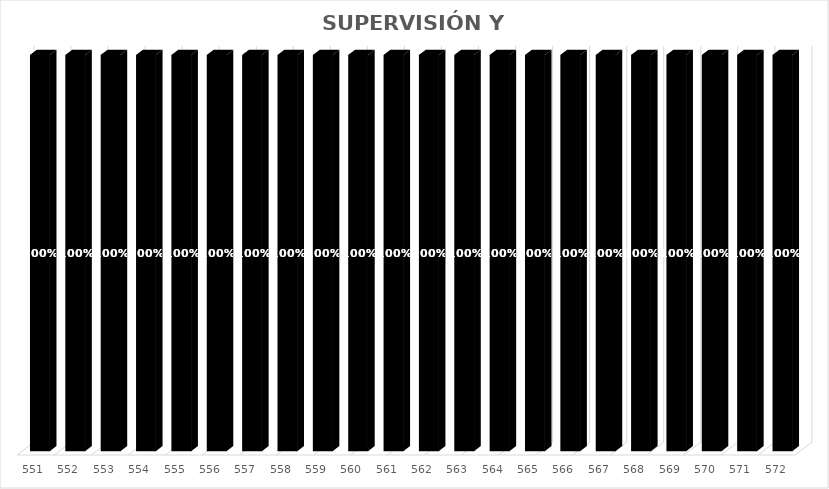
| Category | % Avance |
|---|---|
| 551.0 | 1 |
| 552.0 | 1 |
| 553.0 | 1 |
| 554.0 | 1 |
| 555.0 | 1 |
| 556.0 | 1 |
| 557.0 | 1 |
| 558.0 | 1 |
| 559.0 | 1 |
| 560.0 | 1 |
| 561.0 | 1 |
| 562.0 | 1 |
| 563.0 | 1 |
| 564.0 | 1 |
| 565.0 | 1 |
| 566.0 | 1 |
| 567.0 | 1 |
| 568.0 | 1 |
| 569.0 | 1 |
| 570.0 | 1 |
| 571.0 | 1 |
| 572.0 | 1 |